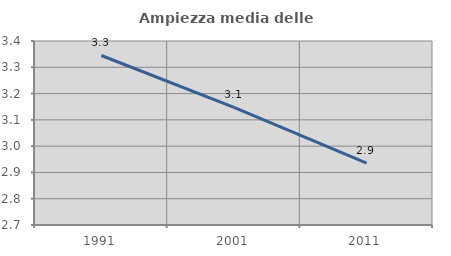
| Category | Ampiezza media delle famiglie |
|---|---|
| 1991.0 | 3.345 |
| 2001.0 | 3.147 |
| 2011.0 | 2.935 |